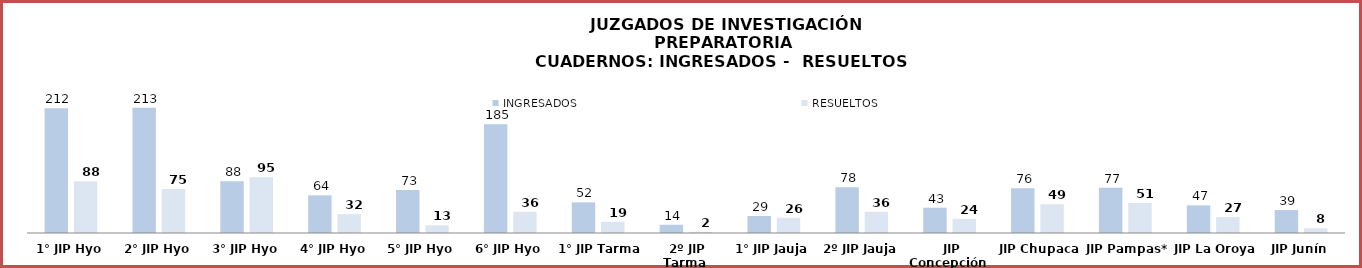
| Category | INGRESADOS | RESUELTOS |
|---|---|---|
| 1° JIP Hyo | 212 | 88 |
| 2° JIP Hyo | 213 | 75 |
| 3° JIP Hyo | 88 | 95 |
| 4° JIP Hyo | 64 | 32 |
| 5° JIP Hyo | 73 | 13 |
| 6° JIP Hyo | 185 | 36 |
| 1° JIP Tarma | 52 | 19 |
| 2º JIP Tarma | 14 | 2 |
| 1° JIP Jauja | 29 | 26 |
| 2º JIP Jauja | 78 | 36 |
| JIP Concepción | 43 | 24 |
| JIP Chupaca | 76 | 49 |
| JIP Pampas*  | 77 | 51 |
| JIP La Oroya | 47 | 27 |
| JIP Junín | 39 | 8 |